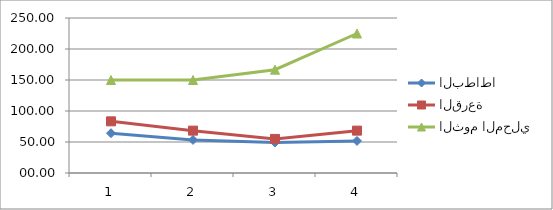
| Category | البطاطا | القرعة | الثوم المحلي |
|---|---|---|---|
| 0 | 64.17 | 83.33 | 150 |
| 1 | 53.33 | 68.33 | 150 |
| 2 | 49.17 | 55 | 166.67 |
| 3 | 51.67 | 68.33 | 225 |